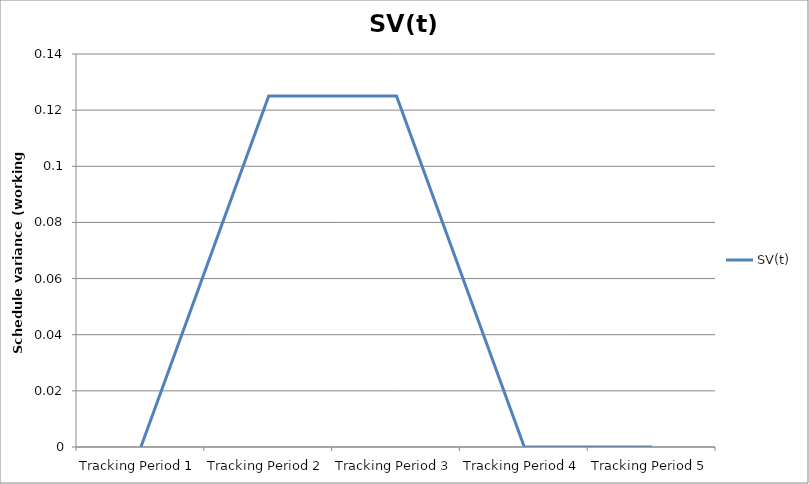
| Category | SV(t) |
|---|---|
| Tracking Period 1 | 0 |
| Tracking Period 2 | 0.125 |
| Tracking Period 3 | 0.125 |
| Tracking Period 4 | 0 |
| Tracking Period 5 | 0 |